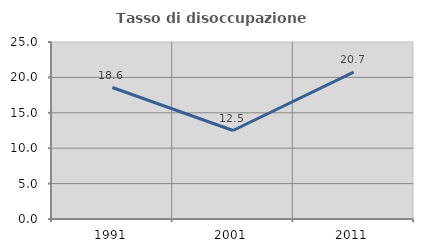
| Category | Tasso di disoccupazione giovanile  |
|---|---|
| 1991.0 | 18.571 |
| 2001.0 | 12.5 |
| 2011.0 | 20.741 |